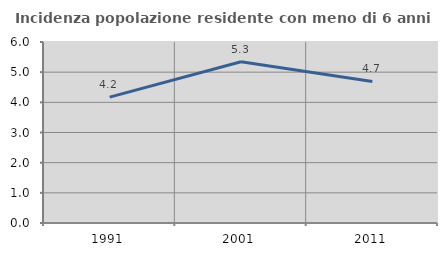
| Category | Incidenza popolazione residente con meno di 6 anni |
|---|---|
| 1991.0 | 4.172 |
| 2001.0 | 5.343 |
| 2011.0 | 4.692 |